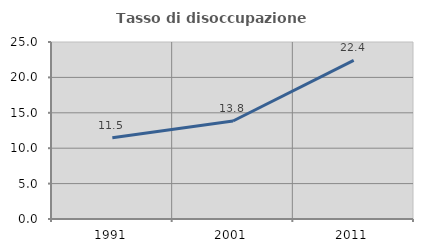
| Category | Tasso di disoccupazione giovanile  |
|---|---|
| 1991.0 | 11.475 |
| 2001.0 | 13.846 |
| 2011.0 | 22.414 |